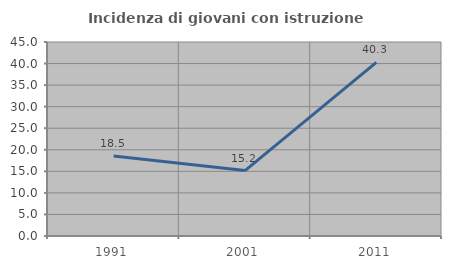
| Category | Incidenza di giovani con istruzione universitaria |
|---|---|
| 1991.0 | 18.543 |
| 2001.0 | 15.172 |
| 2011.0 | 40.26 |